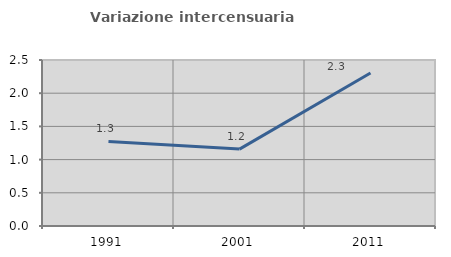
| Category | Variazione intercensuaria annua |
|---|---|
| 1991.0 | 1.274 |
| 2001.0 | 1.158 |
| 2011.0 | 2.304 |